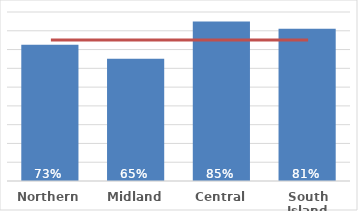
| Category | Total |
|---|---|
| Northern | 0.726 |
| Midland | 0.651 |
| Central | 0.849 |
| South Island | 0.811 |